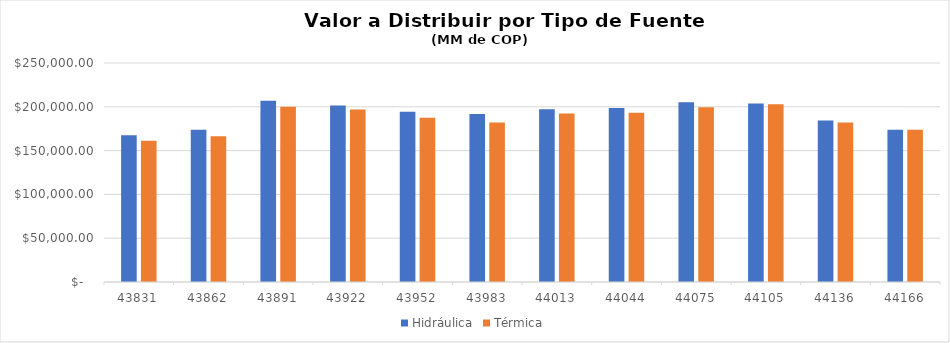
| Category | Hidráulica | Térmica |
|---|---|---|
| 43831.0 | 167660.371 | 161381.23 |
| 43862.0 | 173767.257 | 166364.855 |
| 43891.0 | 206797.742 | 200134.928 |
| 43922.0 | 201543.446 | 196823.405 |
| 43952.0 | 194235.677 | 187438.055 |
| 43983.0 | 191649.882 | 181968.113 |
| 44013.0 | 197295.945 | 192265.197 |
| 44044.0 | 198682.842 | 193075.265 |
| 44075.0 | 205265.743 | 199625.362 |
| 44105.0 | 203762.588 | 202877.294 |
| 44136.0 | 184289.415 | 182012.876 |
| 44166.0 | 173700.811 | 173767.439 |